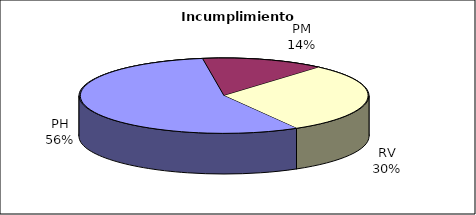
| Category | Valores |
|---|---|
| PH | 305 |
| PM | 75 |
| RV | 165 |